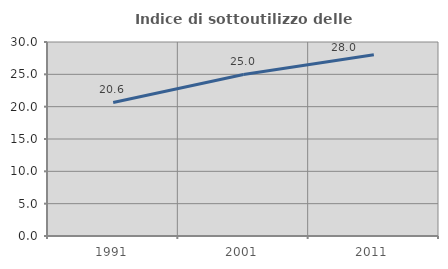
| Category | Indice di sottoutilizzo delle abitazioni  |
|---|---|
| 1991.0 | 20.647 |
| 2001.0 | 24.984 |
| 2011.0 | 28.023 |